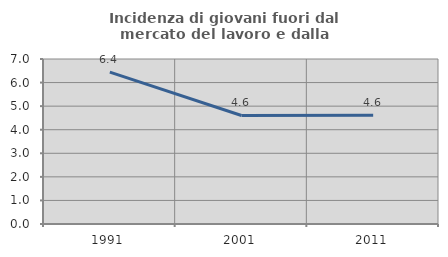
| Category | Incidenza di giovani fuori dal mercato del lavoro e dalla formazione  |
|---|---|
| 1991.0 | 6.442 |
| 2001.0 | 4.604 |
| 2011.0 | 4.617 |